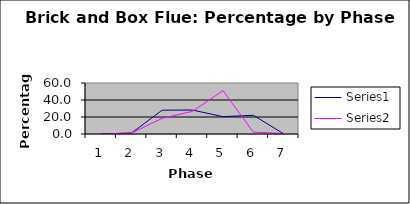
| Category | Series 0 | Series 1 |
|---|---|---|
| 0 | 0 | 0 |
| 1 | 1.23 | 1.203 |
| 2 | 28.01 | 18.385 |
| 3 | 28.194 | 26.632 |
| 4 | 20.393 | 51.031 |
| 5 | 22.016 | 2.234 |
| 6 | 0.157 | 0.515 |